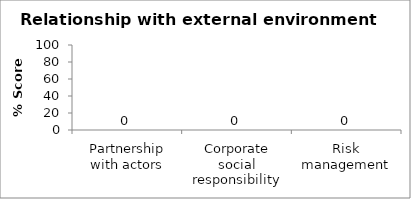
| Category | Series 0 |
|---|---|
| Partnership with actors | 0 |
| Corporate social responsibility | 0 |
| Risk management | 0 |